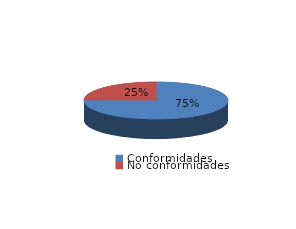
| Category | Series 0 |
|---|---|
| Conformidades | 1990 |
| No conformidades | 660 |